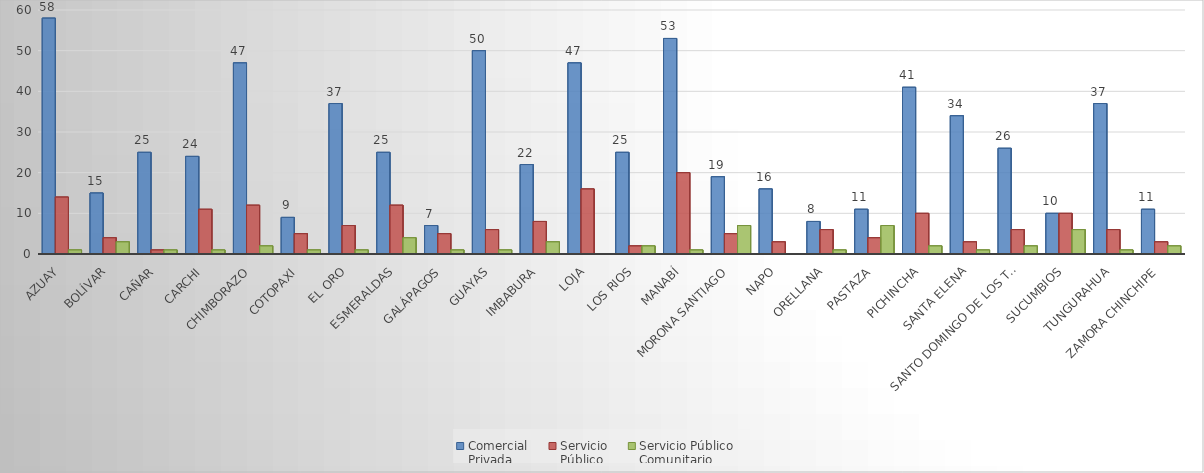
| Category | Comercial 
Privada | Servicio 
Público | Servicio Público
Comunitario |
|---|---|---|---|
| Azuay | 58 | 14 | 1 |
| Bolívar | 15 | 4 | 3 |
| Cañar | 25 | 1 | 1 |
| Carchi | 24 | 11 | 1 |
| Chimborazo | 47 | 12 | 2 |
| Cotopaxi | 9 | 5 | 1 |
| El Oro | 37 | 7 | 1 |
| Esmeraldas | 25 | 12 | 4 |
| Galápagos | 7 | 5 | 1 |
| Guayas | 50 | 6 | 1 |
| Imbabura | 22 | 8 | 3 |
| Loja | 47 | 16 | 0 |
| Los Rios | 25 | 2 | 2 |
| Manabí | 53 | 20 | 1 |
| Morona Santiago | 19 | 5 | 7 |
| Napo | 16 | 3 | 0 |
| Orellana | 8 | 6 | 1 |
| Pastaza | 11 | 4 | 7 |
| Pichincha | 41 | 10 | 2 |
| Santa Elena | 34 | 3 | 1 |
| Santo Domingo de los Tsáchilas | 26 | 6 | 2 |
| Sucumbios | 10 | 10 | 6 |
| Tungurahua | 37 | 6 | 1 |
| Zamora Chinchipe | 11 | 3 | 2 |